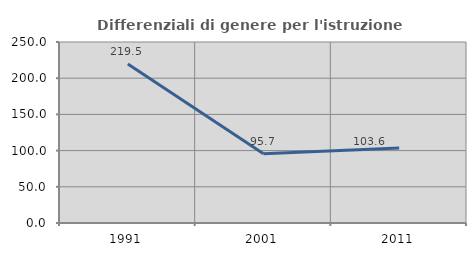
| Category | Differenziali di genere per l'istruzione superiore |
|---|---|
| 1991.0 | 219.465 |
| 2001.0 | 95.672 |
| 2011.0 | 103.571 |